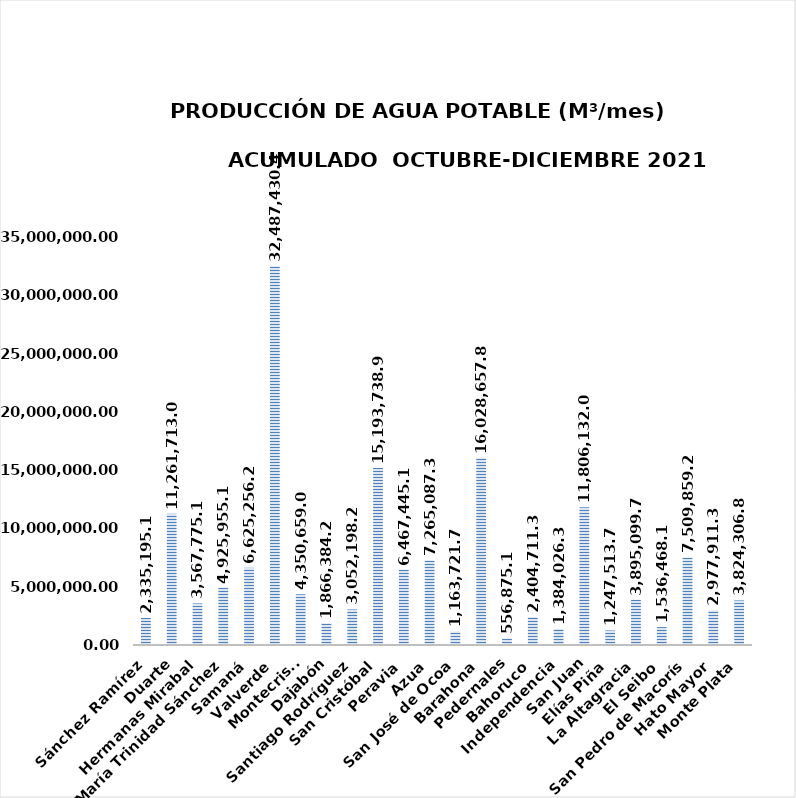
| Category | 2,335,195.14 |
|---|---|
| Sánchez Ramírez | 2335195.136 |
| Duarte | 11261713.088 |
| Hermanas Mirabal | 3567775.186 |
| María Trinidad Sánchez | 4925955.188 |
| Samaná | 6625256.294 |
| Valverde | 32487430.464 |
| Montecristi | 4350659.04 |
| Dajabón | 1866384.272 |
| Santiago Rodríguez | 3052198.214 |
| San Cristóbal | 15193738.954 |
| Peravia | 6467445.095 |
| Azua | 7265087.364 |
| San José de Ocoa | 1163721.775 |
| Barahona | 16028657.856 |
| Pedernales | 556875.13 |
| Bahoruco | 2404711.394 |
| Independencia | 1384026.327 |
| San Juan | 11806132.032 |
| Elías Piña | 1247513.73 |
| La Altagracia | 3895099.776 |
| El Seibo | 1536468.144 |
| San Pedro de Macorís | 7509859.2 |
| Hato Mayor | 2977911.36 |
| Monte Plata | 3824306.834 |